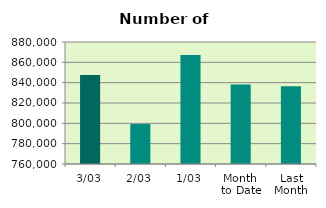
| Category | Series 0 |
|---|---|
| 3/03 | 847648 |
| 2/03 | 799304 |
| 1/03 | 867280 |
| Month 
to Date | 838077.333 |
| Last
Month | 836497.7 |